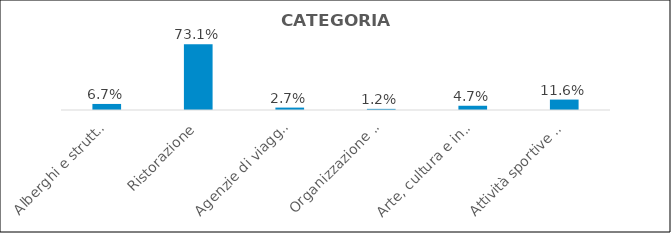
| Category | Series 0 |
|---|---|
| Alberghi e strutture ricettive | 0.067 |
| Ristorazione | 0.731 |
| Agenzie di viaggi e tour operator | 0.027 |
| Organizzazione di convegni e fiere | 0.012 |
| Arte, cultura e intrattenimento | 0.047 |
| Attività sportive e ricreative | 0.116 |